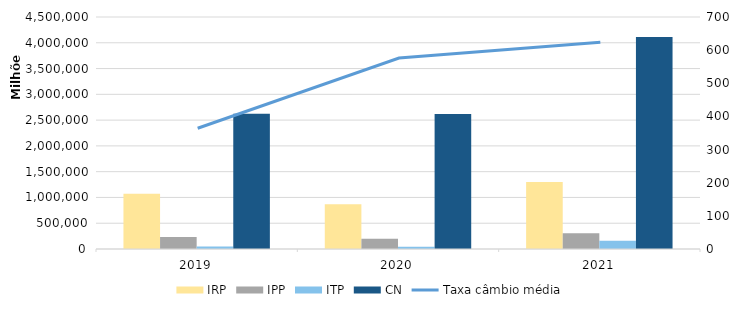
| Category | IRP | IPP | ITP | CN |
|---|---|---|---|---|
| 2019.0 | 1072150148212.37 | 233893188920.39 | 50287924743.82 | 2622430588851 |
| 2020.0 | 870242458299 | 199093306724 | 44380220095 | 2619589171993 |
| 2021.0 | 1297844157410.64 | 303745861608 | 157738673065 | 4113507324764.27 |